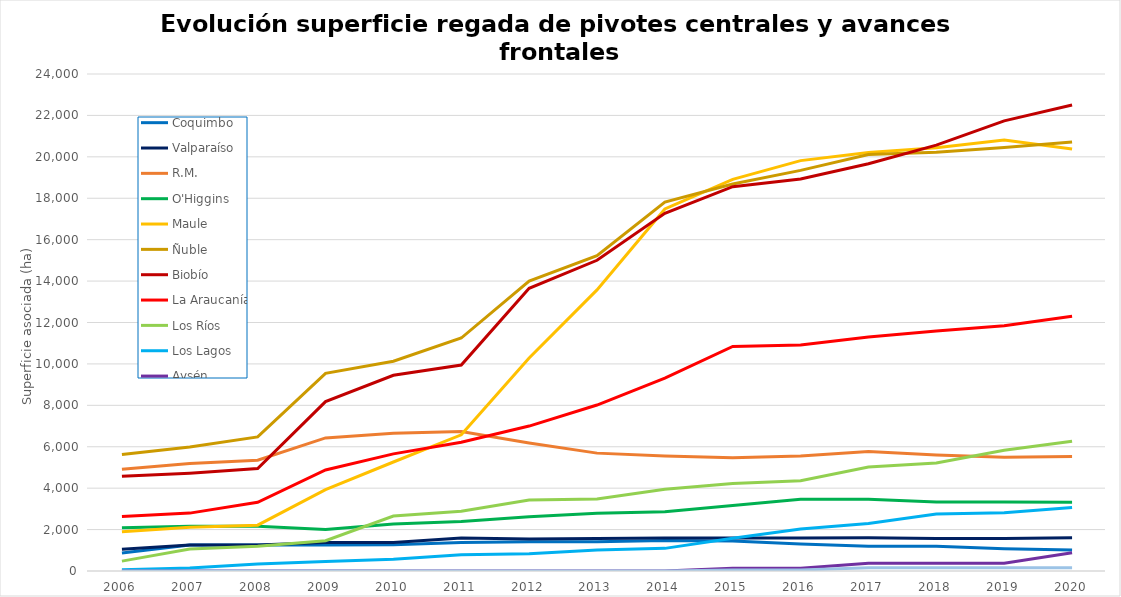
| Category | Coquimbo | Valparaíso | R.M. | O'Higgins | Maule | Ñuble | Biobío | La Araucanía | Los Ríos | Los Lagos | Aysén | Magallanes |
|---|---|---|---|---|---|---|---|---|---|---|---|---|
| 2006.0 | 874 | 1045 | 4912 | 2090 | 1898 | 5627 | 4571 | 2635 | 476 | 55 | 0 | 0 |
| 2007.0 | 1258 | 1253 | 5193 | 2161 | 2109 | 5993 | 4725 | 2795 | 1059 | 140 | 0 | 0 |
| 2008.0 | 1258 | 1253 | 5347 | 2161 | 2214 | 6475 | 4949 | 3318 | 1195 | 342 | 0 | 0 |
| 2009.0 | 1258 | 1378 | 6425 | 2005 | 3928 | 9545 | 8179 | 4877 | 1465 | 456 | 0 | 0 |
| 2010.0 | 1273 | 1378 | 6646 | 2269 | 5264 | 10131 | 9451 | 5657 | 2654 | 573 | 0 | 0 |
| 2011.0 | 1375 | 1589 | 6733 | 2388 | 6577 | 11250 | 9944 | 6221 | 2889 | 780 | 0 | 0 |
| 2012.0 | 1411 | 1548 | 6180 | 2616 | 10290 | 14004 | 13648 | 6998 | 3423 | 828 | 0 | 0 |
| 2013.0 | 1411 | 1568 | 5692 | 2789 | 13575 | 15226 | 15005 | 8015 | 3473 | 1010 | 0 | 0 |
| 2014.0 | 1472 | 1596 | 5553 | 2865 | 17485 | 17812 | 17271 | 9318 | 3943 | 1093 | 0 | 0 |
| 2015.0 | 1451 | 1596 | 5466 | 3158 | 18910 | 18689 | 18559 | 10843 | 4220 | 1584 | 128 | 51 |
| 2016.0 | 1303 | 1596 | 5549 | 3461 | 19818 | 19347 | 18930 | 10916 | 4360 | 2028 | 128 | 51 |
| 2017.0 | 1201 | 1606 | 5768 | 3463 | 20206 | 20111 | 19667 | 11300 | 5026 | 2296 | 380 | 153 |
| 2018.0 | 1201 | 1567 | 5601 | 3333 | 20443 | 20217 | 20563 | 11586 | 5217 | 2748 | 380 | 153 |
| 2019.0 | 1078 | 1567 | 5496 | 3329 | 20818 | 20449 | 21738 | 11838 | 5834 | 2811 | 380 | 153 |
| 2020.0 | 1011 | 1610 | 5529 | 3314 | 20377 | 20713 | 22499 | 12307 | 6270 | 3063 | 877 | 153 |